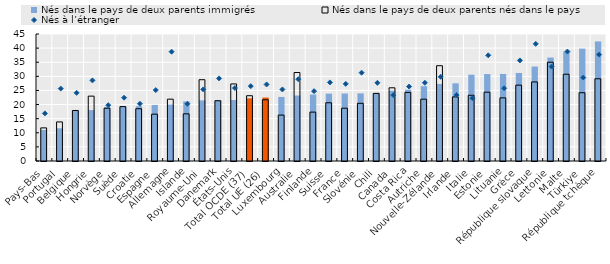
| Category | Nés dans le pays de deux parents immigrés | Nés dans le pays de deux parents nés dans le pays |
|---|---|---|
| Pays-Bas | 11.015 | 11.734 |
| Portugal | 11.595 | 13.85 |
| Belgique | 17.895 | 17.899 |
| Hongrie | 18.055 | 22.985 |
| Norvège | 19.068 | 18.706 |
| Suède | 19.395 | 19.268 |
| Croatie | 19.415 | 18.52 |
| Espagne | 19.866 | 16.598 |
| Allemagne | 20.003 | 21.909 |
| Islande | 21.112 | 16.714 |
| Royaume-Uni | 21.473 | 28.803 |
| Danemark | 21.592 | 21.344 |
| États-Unis | 21.614 | 27.31 |
| Total OCDE (37) | 22.214 | 23.134 |
| Total UE (26) | 22.485 | 21.701 |
| Luxembourg | 22.697 | 16.271 |
| Australie | 23.203 | 31.359 |
| Finlande | 23.542 | 17.318 |
| Suisse | 23.863 | 20.632 |
| France | 23.911 | 18.702 |
| Slovénie | 23.96 | 20.446 |
| Chili | 24.124 | 23.955 |
| Canada | 24.927 | 25.933 |
| Costa Rica | 25.234 | 24.3 |
| Autriche | 26.508 | 21.9 |
| Nouvelle-Zélande | 27.318 | 33.764 |
| Irlande | 27.521 | 22.717 |
| Italie | 30.583 | 23.294 |
| Estonie | 30.81 | 24.383 |
| Lituanie | 30.849 | 22.37 |
| Grèce | 31.195 | 26.882 |
| République slovaque | 33.466 | 28.016 |
| Lettonie | 36.656 | 35.001 |
| Malte | 38.788 | 30.745 |
| Türkiye | 39.818 | 24.19 |
| République tchèque | 42.366 | 29.135 |